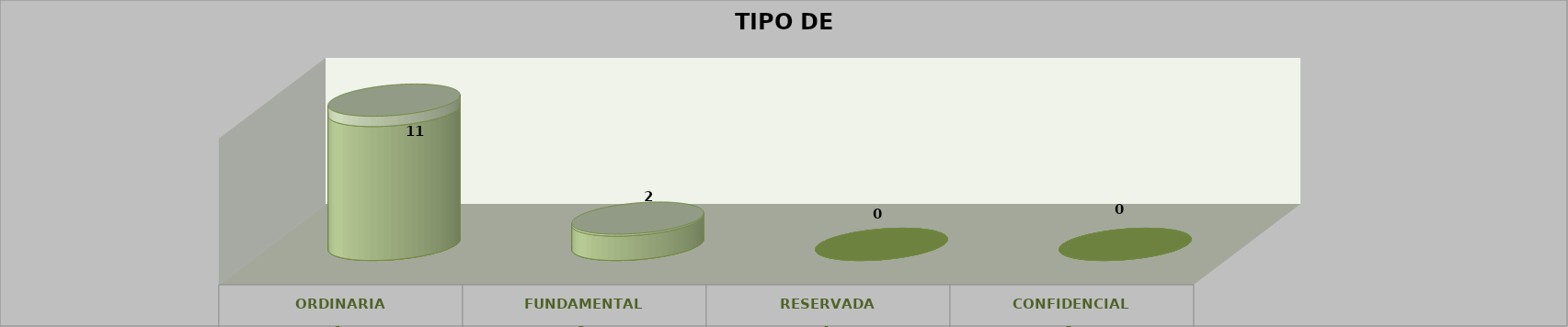
| Category | Series 0 | Series 2 | Series 1 | Series 3 | Series 4 |
|---|---|---|---|---|---|
| 0 |  |  |  | 11 | 0.846 |
| 1 |  |  |  | 2 | 0.154 |
| 2 |  |  |  | 0 | 0 |
| 3 |  |  |  | 0 | 0 |